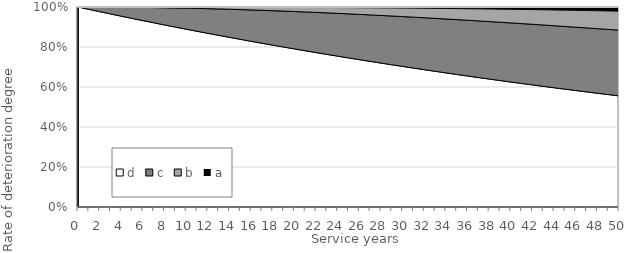
| Category | d | c | b | a |
|---|---|---|---|---|
| 0.0 | 1 | 0 | 0 | 0 |
| 1.0 | 0.988 | 0.012 | 0 | 0 |
| 2.0 | 0.977 | 0.023 | 0 | 0 |
| 3.0 | 0.965 | 0.034 | 0 | 0 |
| 4.0 | 0.954 | 0.045 | 0.001 | 0 |
| 5.0 | 0.943 | 0.056 | 0.001 | 0 |
| 6.0 | 0.932 | 0.066 | 0.002 | 0 |
| 7.0 | 0.921 | 0.076 | 0.003 | 0 |
| 8.0 | 0.91 | 0.086 | 0.004 | 0 |
| 9.0 | 0.9 | 0.096 | 0.005 | 0 |
| 10.0 | 0.889 | 0.105 | 0.006 | 0 |
| 11.0 | 0.879 | 0.114 | 0.007 | 0 |
| 12.0 | 0.868 | 0.123 | 0.008 | 0 |
| 13.0 | 0.858 | 0.132 | 0.009 | 0 |
| 14.0 | 0.848 | 0.14 | 0.011 | 0.001 |
| 15.0 | 0.838 | 0.149 | 0.012 | 0.001 |
| 16.0 | 0.829 | 0.157 | 0.014 | 0.001 |
| 17.0 | 0.819 | 0.165 | 0.016 | 0.001 |
| 18.0 | 0.809 | 0.172 | 0.017 | 0.001 |
| 19.0 | 0.8 | 0.18 | 0.019 | 0.001 |
| 20.0 | 0.791 | 0.187 | 0.021 | 0.002 |
| 21.0 | 0.781 | 0.194 | 0.023 | 0.002 |
| 22.0 | 0.772 | 0.201 | 0.025 | 0.002 |
| 23.0 | 0.763 | 0.207 | 0.027 | 0.002 |
| 24.0 | 0.754 | 0.214 | 0.029 | 0.003 |
| 25.0 | 0.745 | 0.22 | 0.031 | 0.003 |
| 26.0 | 0.737 | 0.226 | 0.033 | 0.003 |
| 27.0 | 0.728 | 0.232 | 0.036 | 0.004 |
| 28.0 | 0.72 | 0.238 | 0.038 | 0.004 |
| 29.0 | 0.711 | 0.244 | 0.04 | 0.005 |
| 30.0 | 0.703 | 0.249 | 0.043 | 0.005 |
| 31.0 | 0.695 | 0.255 | 0.045 | 0.006 |
| 32.0 | 0.687 | 0.26 | 0.048 | 0.006 |
| 33.0 | 0.679 | 0.265 | 0.05 | 0.007 |
| 34.0 | 0.671 | 0.27 | 0.053 | 0.007 |
| 35.0 | 0.663 | 0.274 | 0.055 | 0.008 |
| 36.0 | 0.655 | 0.279 | 0.058 | 0.009 |
| 37.0 | 0.647 | 0.283 | 0.06 | 0.009 |
| 38.0 | 0.64 | 0.287 | 0.063 | 0.01 |
| 39.0 | 0.632 | 0.292 | 0.065 | 0.011 |
| 40.0 | 0.625 | 0.295 | 0.068 | 0.011 |
| 41.0 | 0.618 | 0.299 | 0.071 | 0.012 |
| 42.0 | 0.61 | 0.303 | 0.073 | 0.013 |
| 43.0 | 0.603 | 0.307 | 0.076 | 0.014 |
| 44.0 | 0.596 | 0.31 | 0.079 | 0.015 |
| 45.0 | 0.589 | 0.313 | 0.082 | 0.016 |
| 46.0 | 0.582 | 0.317 | 0.084 | 0.017 |
| 47.0 | 0.576 | 0.32 | 0.087 | 0.018 |
| 48.0 | 0.569 | 0.323 | 0.09 | 0.019 |
| 49.0 | 0.562 | 0.326 | 0.092 | 0.02 |
| 50.0 | 0.556 | 0.328 | 0.095 | 0.021 |